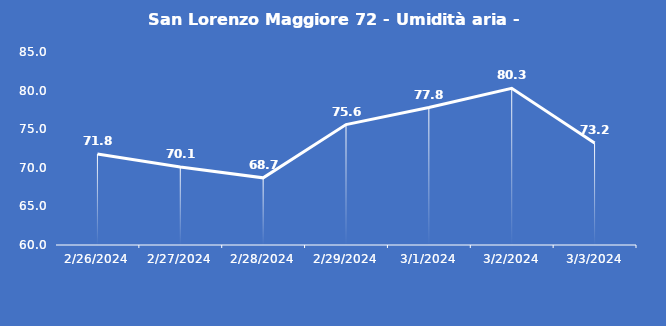
| Category | San Lorenzo Maggiore 72 - Umidità aria - Grezzo (%) |
|---|---|
| 2/26/24 | 71.8 |
| 2/27/24 | 70.1 |
| 2/28/24 | 68.7 |
| 2/29/24 | 75.6 |
| 3/1/24 | 77.8 |
| 3/2/24 | 80.3 |
| 3/3/24 | 73.2 |